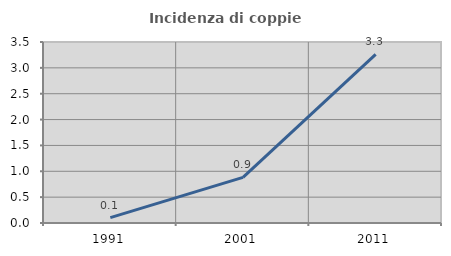
| Category | Incidenza di coppie miste |
|---|---|
| 1991.0 | 0.104 |
| 2001.0 | 0.883 |
| 2011.0 | 3.259 |